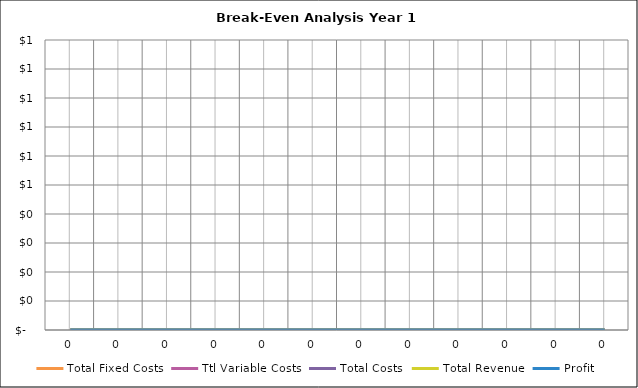
| Category | Total Fixed Costs | Ttl Variable Costs | Total Costs | Total Revenue | Profit |
|---|---|---|---|---|---|
| 0.0 | 0 | 0 | 0 | 0 | 0 |
| 0.0 | 0 | 0 | 0 | 0 | 0 |
| 0.0 | 0 | 0 | 0 | 0 | 0 |
| 0.0 | 0 | 0 | 0 | 0 | 0 |
| 0.0 | 0 | 0 | 0 | 0 | 0 |
| 0.0 | 0 | 0 | 0 | 0 | 0 |
| 0.0 | 0 | 0 | 0 | 0 | 0 |
| 0.0 | 0 | 0 | 0 | 0 | 0 |
| 0.0 | 0 | 0 | 0 | 0 | 0 |
| 0.0 | 0 | 0 | 0 | 0 | 0 |
| 0.0 | 0 | 0 | 0 | 0 | 0 |
| 0.0 | 0 | 0 | 0 | 0 | 0 |